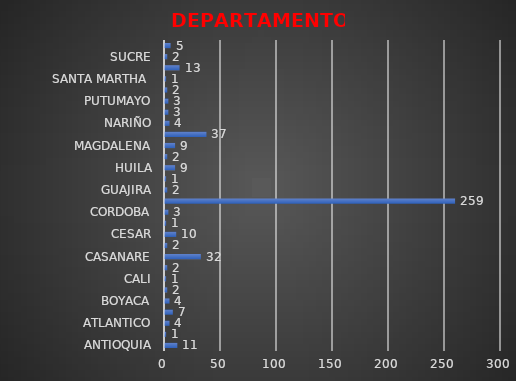
| Category | Series 0 |
|---|---|
| ANTIOQUIA | 11 |
| ARAUCA | 1 |
| ATLANTICO | 4 |
| BOLIVAR | 7 |
| BOYACA | 4 |
| CALDAS | 2 |
| CALI | 1 |
| CAQUETA | 2 |
| CASANARE | 32 |
| CAUCA | 2 |
| CESAR | 10 |
| CHOCO | 1 |
| CORDOBA | 3 |
| CUNDINAMARCA | 259 |
| GUAJIRA | 2 |
| GUAVIARE | 1 |
| HUILA | 9 |
| LA GUAJIRA | 2 |
| MAGDALENA | 9 |
| META | 37 |
| NARIÑO | 4 |
| NORTE DE SANTANDER | 3 |
| PUTUMAYO | 3 |
| RISARALDA | 2 |
| SANTA MARTHA  | 1 |
| SANTANDER | 13 |
| SUCRE | 2 |
| TOLIMA | 5 |